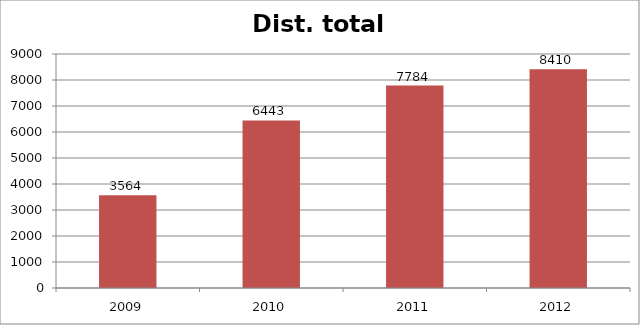
| Category | Dist. total |
|---|---|
| 2009.0 | 3564 |
| 2010.0 | 6443 |
| 2011.0 | 7784 |
| 2012.0 | 8410 |